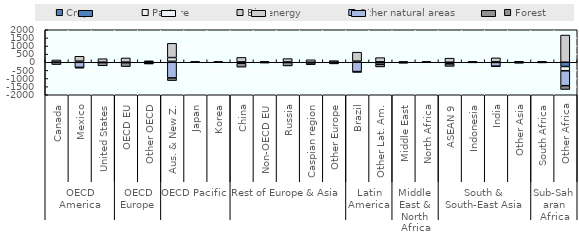
| Category | Crops | Pasture | Bio-energy | Other natural areas | Forest |
|---|---|---|---|---|---|
| 0 | -1136.641 | 2278.375 | 138834.859 | -5863.75 | -134113.5 |
| 1 | -3571.203 | 66470.875 | 300907.781 | -310313.406 | -45465.922 |
| 2 | -3681.984 | -4104.5 | 218003.984 | -14032.25 | -196182.25 |
| 3 | 6152.719 | -12221.938 | 258610.531 | -15402.133 | -237139.375 |
| 4 | 3306.945 | 34524.844 | 46346.18 | -81575.75 | -2602.438 |
| 5 | 61152.625 | 226583.5 | 876798.75 | -965253.625 | -163075.406 |
| 6 | 75.702 | -632.404 | 4186.899 | 0 | -3630.188 |
| 7 | -450.795 | 582.197 | 1035.662 | 0 | -1167.07 |
| 8 | 2296.938 | 18813.25 | 277272.312 | -62678.625 | -235701.125 |
| 9 | -2782.305 | 10739.375 | 38597.523 | 0 | -46554.562 |
| 10 | 11762.531 | 4224.875 | 209709.219 | -17247 | -208449 |
| 11 | -790.734 | -111216.875 | 152367.047 | -27151.062 | 0 |
| 12 | -631.078 | 1898.547 | 97601.297 | -11046.18 | -87822.438 |
| 13 | 41188.75 | 27559.125 | 551278.438 | -573547.438 | -46479.25 |
| 14 | 25151.562 | -5866.75 | 260235.062 | -115694.875 | -163826.75 |
| 15 | 2140.793 | -33680.5 | 38297.691 | -4495 | 0 |
| 16 | -1553.189 | 4780.125 | 196.892 | -3497.172 | 0 |
| 17 | -29717.547 | -1630.336 | 251449.984 | -68172.562 | -151929.625 |
| 18 | 7393.235 | -7451.938 | 4847.296 | 0 | -4789.062 |
| 19 | -13099.484 | 26501.156 | 244442.859 | -230160.688 | -27683.938 |
| 20 | -1730.477 | 23027.375 | 28642.227 | -24149.281 | -20753.5 |
| 21 | -3345.281 | 200.438 | 21026.18 | -5343.766 | -12537.516 |
| 22 | -259956.035 | -265547 | 1674796.285 | -917585.125 | -231701.5 |